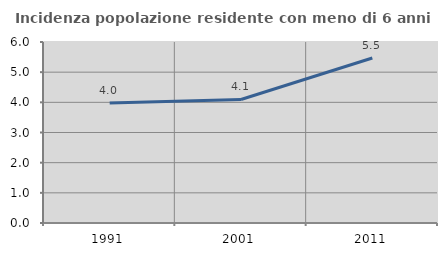
| Category | Incidenza popolazione residente con meno di 6 anni |
|---|---|
| 1991.0 | 3.977 |
| 2001.0 | 4.096 |
| 2011.0 | 5.469 |